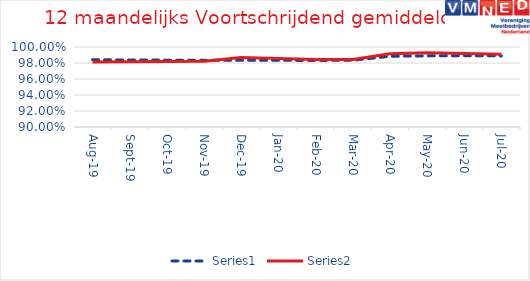
| Category | Series 0 | Series 1 |
|---|---|---|
| 2019-08-01 | 0.984 | 0.981 |
| 2019-09-01 | 0.984 | 0.982 |
| 2019-10-01 | 0.984 | 0.982 |
| 2019-11-01 | 0.983 | 0.982 |
| 2019-12-01 | 0.983 | 0.987 |
| 2020-01-01 | 0.983 | 0.986 |
| 2020-02-01 | 0.983 | 0.985 |
| 2020-03-01 | 0.983 | 0.984 |
| 2020-04-01 | 0.988 | 0.992 |
| 2020-05-01 | 0.989 | 0.993 |
| 2020-06-01 | 0.989 | 0.992 |
| 2020-07-01 | 0.989 | 0.991 |